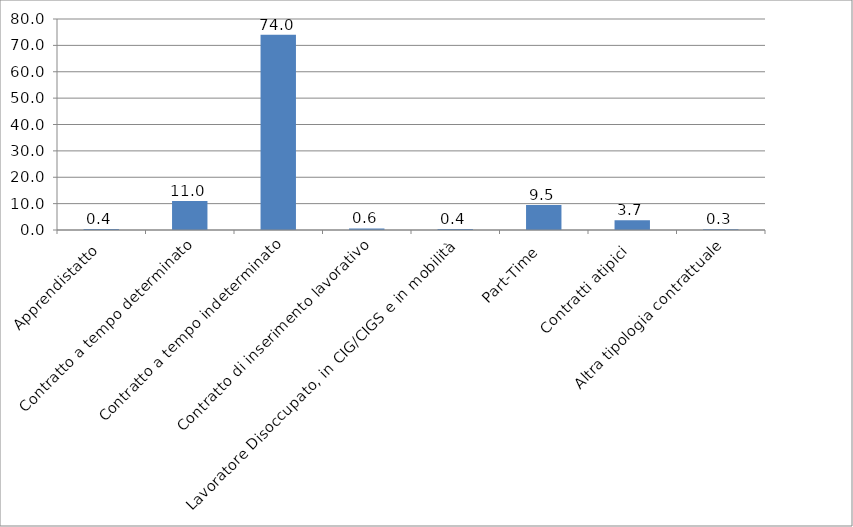
| Category | Series 0 |
|---|---|
| Apprendistatto | 0.4 |
| Contratto a tempo determinato | 11 |
| Contratto a tempo indeterminato | 74 |
| Contratto di inserimento lavorativo | 0.6 |
| Lavoratore Disoccupato, in CIG/CIGS e in mobilità | 0.4 |
| Part-Time | 9.5 |
| Contratti atipici | 3.7 |
| Altra tipologia contrattuale | 0.3 |